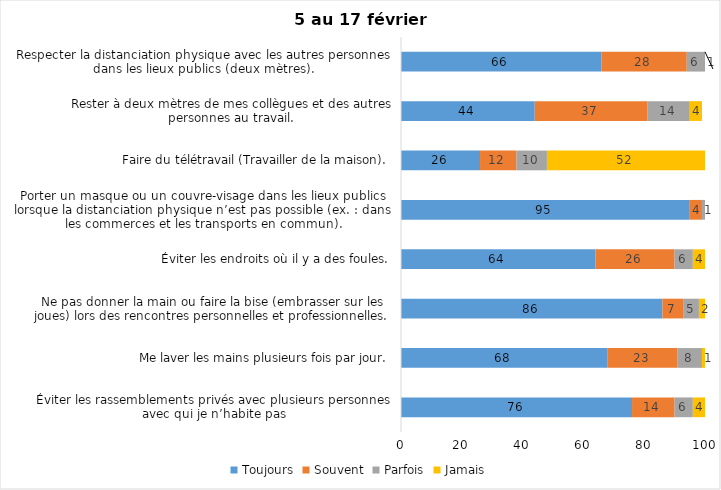
| Category | Toujours | Souvent | Parfois | Jamais |
|---|---|---|---|---|
| Éviter les rassemblements privés avec plusieurs personnes avec qui je n’habite pas | 76 | 14 | 6 | 4 |
| Me laver les mains plusieurs fois par jour. | 68 | 23 | 8 | 1 |
| Ne pas donner la main ou faire la bise (embrasser sur les joues) lors des rencontres personnelles et professionnelles. | 86 | 7 | 5 | 2 |
| Éviter les endroits où il y a des foules. | 64 | 26 | 6 | 4 |
| Porter un masque ou un couvre-visage dans les lieux publics lorsque la distanciation physique n’est pas possible (ex. : dans les commerces et les transports en commun). | 95 | 4 | 1 | 0 |
| Faire du télétravail (Travailler de la maison). | 26 | 12 | 10 | 52 |
| Rester à deux mètres de mes collègues et des autres personnes au travail. | 44 | 37 | 14 | 4 |
| Respecter la distanciation physique avec les autres personnes dans les lieux publics (deux mètres). | 66 | 28 | 6 | 1 |